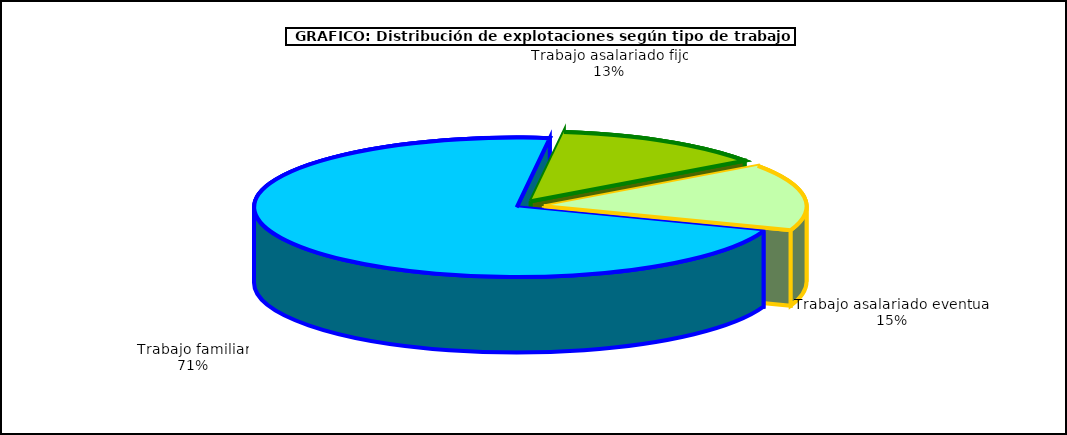
| Category | Series 0 |
|---|---|
| 0 | 857924 |
| 1 | 157591 |
| 2 | 185118 |